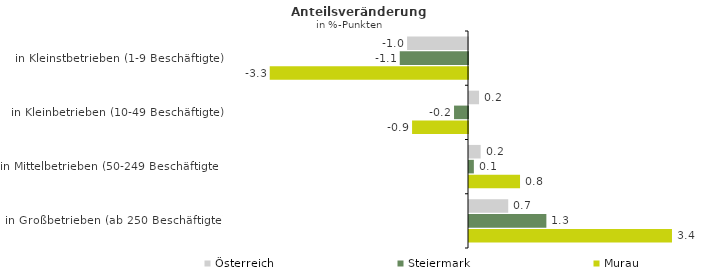
| Category | Österreich | Steiermark | Murau |
|---|---|---|---|
| in Kleinstbetrieben (1-9 Beschäftigte) | -1.011 | -1.133 | -3.291 |
| in Kleinbetrieben (10-49 Beschäftigte) | 0.167 | -0.232 | -0.928 |
| in Mittelbetrieben (50-249 Beschäftigte) | 0.193 | 0.081 | 0.847 |
| in Großbetrieben (ab 250 Beschäftigte) | 0.651 | 1.284 | 3.369 |